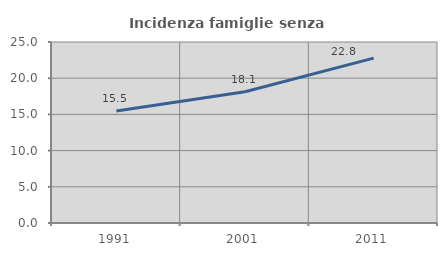
| Category | Incidenza famiglie senza nuclei |
|---|---|
| 1991.0 | 15.472 |
| 2001.0 | 18.132 |
| 2011.0 | 22.772 |